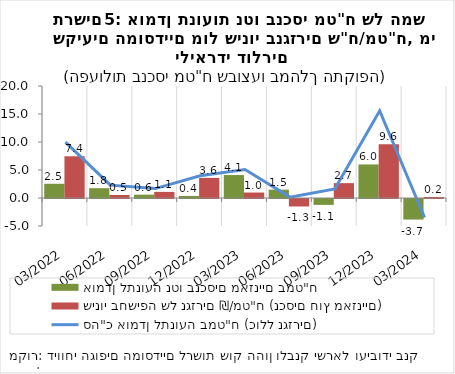
| Category | אומדן לתנועה נטו בנכסים מאזניים במט"ח | שינוי בחשיפה של נגזרים ₪/מט"ח (נכסים חוץ מאזניים) |
|---|---|---|
| 2022-03-31 | 2.537 | 7.444 |
| 2022-06-30 | 1.751 | 0.543 |
| 2022-09-30 | 0.595 | 1.089 |
| 2022-12-31 | 0.369 | 3.592 |
| 2023-03-31 | 4.097 | 0.976 |
| 2023-06-30 | 1.493 | -1.335 |
| 2023-09-30 | -1.052 | 2.656 |
| 2023-12-31 | 5.992 | 9.584 |
| 2024-03-31 | -3.67 | 0.189 |